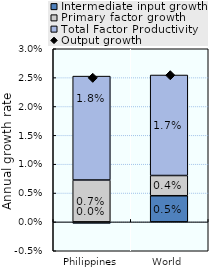
| Category | Intermediate input growth | Primary factor growth | Total Factor Productivity |
|---|---|---|---|
| Philippines | 0 | 0.007 | 0.018 |
| World | 0.005 | 0.004 | 0.017 |